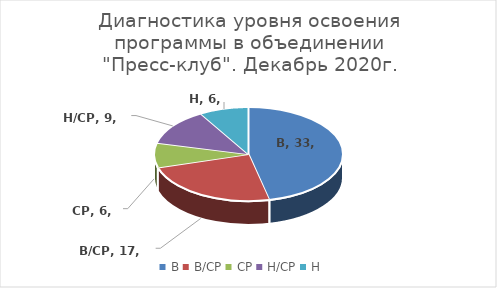
| Category | Series 0 |
|---|---|
| В | 33 |
| В/СР | 17 |
| СР | 6 |
| Н/СР | 9 |
| Н | 6 |